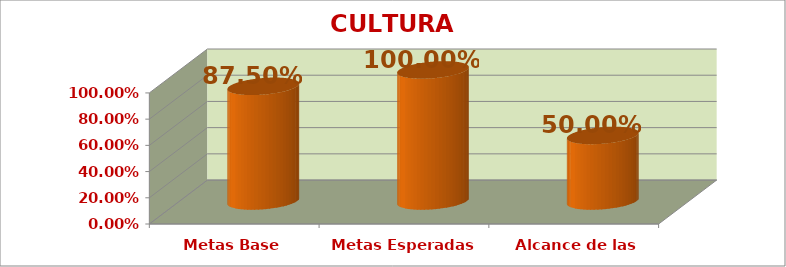
| Category | CULTURA INSTITUCIONAL |
|---|---|
| Metas Base | 0.875 |
| Metas Esperadas | 1 |
| Alcance de las Metas | 0.5 |